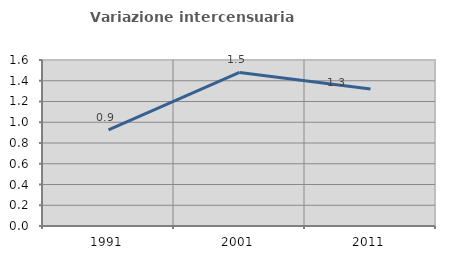
| Category | Variazione intercensuaria annua |
|---|---|
| 1991.0 | 0.925 |
| 2001.0 | 1.48 |
| 2011.0 | 1.32 |